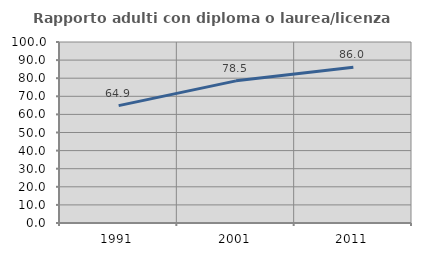
| Category | Rapporto adulti con diploma o laurea/licenza media  |
|---|---|
| 1991.0 | 64.853 |
| 2001.0 | 78.53 |
| 2011.0 | 86.027 |